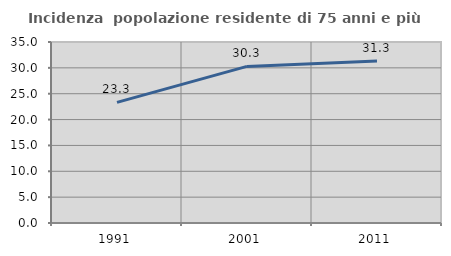
| Category | Incidenza  popolazione residente di 75 anni e più |
|---|---|
| 1991.0 | 23.317 |
| 2001.0 | 30.284 |
| 2011.0 | 31.321 |